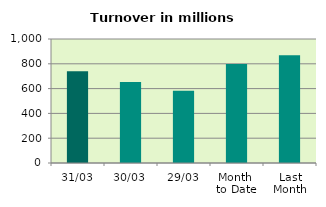
| Category | Series 0 |
|---|---|
| 31/03 | 740.061 |
| 30/03 | 653.635 |
| 29/03 | 583.318 |
| Month 
to Date | 798.115 |
| Last
Month | 868.35 |